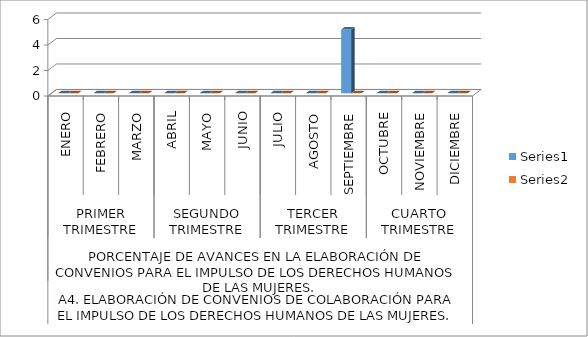
| Category | Series 0 | Series 1 |
|---|---|---|
| 0 | 0 | 0 |
| 1 | 0 | 0 |
| 2 | 0 | 0 |
| 3 | 0 | 0 |
| 4 | 0 | 0 |
| 5 | 0 | 0 |
| 6 | 0 | 0 |
| 7 | 0 | 0 |
| 8 | 5 | 0 |
| 9 | 0 | 0 |
| 10 | 0 | 0 |
| 11 | 0 | 0 |